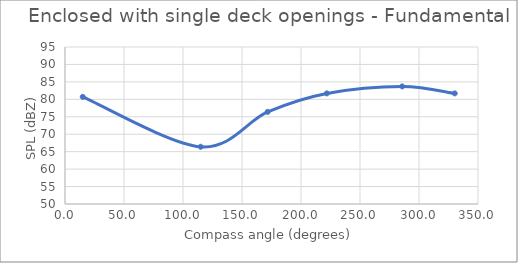
| Category | Series 0 |
|---|---|
| 15.06445125542554 | 80.7 |
| 115.00449447818254 | 66.4 |
| 171.7068171198818 | 76.4 |
| 221.8691292075067 | 81.7 |
| 285.7828166838848 | 83.7 |
| 330.28010595813004 | 81.7 |